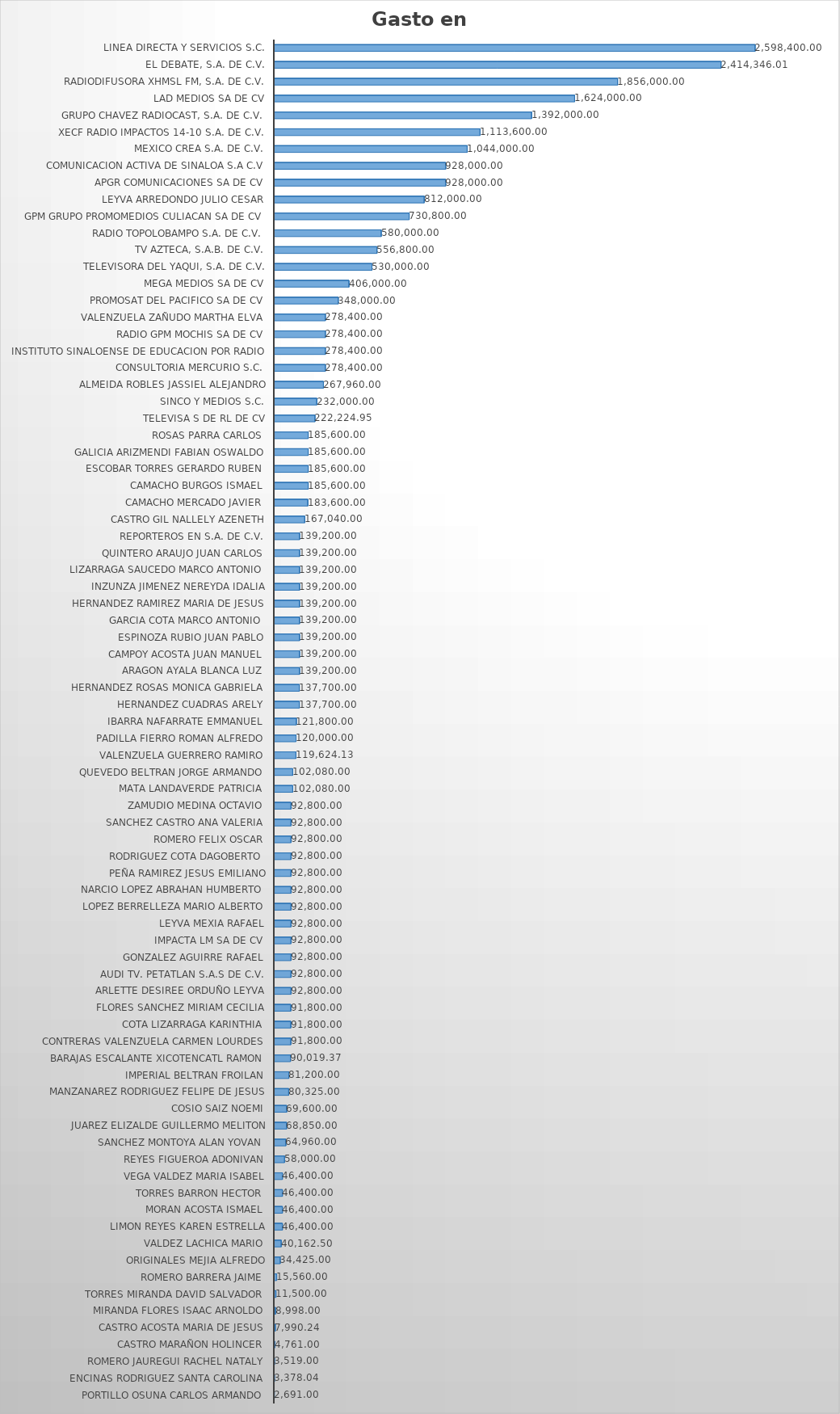
| Category | Suma |
|---|---|
| PORTILLO OSUNA CARLOS ARMANDO | 2691 |
| ENCINAS RODRIGUEZ SANTA CAROLINA | 3378.04 |
| ROMERO JAUREGUI RACHEL NATALY | 3519 |
| CASTRO MARAÑON HOLINCER | 4761 |
| CASTRO ACOSTA MARIA DE JESUS | 7990.24 |
| MIRANDA FLORES ISAAC ARNOLDO | 8998 |
| TORRES MIRANDA DAVID SALVADOR | 11500 |
| ROMERO BARRERA JAIME | 15560 |
| ORIGINALES MEJIA ALFREDO | 34425 |
| VALDEZ LACHICA MARIO | 40162.5 |
| LIMON REYES KAREN ESTRELLA | 46400 |
| MORAN ACOSTA ISMAEL | 46400 |
| TORRES BARRON HECTOR | 46400 |
| VEGA VALDEZ MARIA ISABEL | 46400 |
| REYES FIGUEROA ADONIVAN | 58000 |
| SANCHEZ MONTOYA ALAN YOVAN | 64960 |
| JUAREZ ELIZALDE GUILLERMO MELITON | 68850 |
| COSIO SAIZ NOEMI | 69600 |
| MANZANAREZ RODRIGUEZ FELIPE DE JESUS | 80325 |
| IMPERIAL BELTRAN FROILAN | 81200 |
| BARAJAS ESCALANTE XICOTENCATL RAMON | 90019.37 |
| CONTRERAS VALENZUELA CARMEN LOURDES | 91800 |
| COTA LIZARRAGA KARINTHIA | 91800 |
| FLORES SANCHEZ MIRIAM CECILIA | 91800 |
| ARLETTE DESIREE ORDUÑO LEYVA | 92800 |
| AUDI TV. PETATLAN S.A.S DE C.V. | 92800 |
| GONZALEZ AGUIRRE RAFAEL | 92800 |
| IMPACTA LM SA DE CV | 92800 |
| LEYVA MEXIA RAFAEL | 92800 |
| LOPEZ BERRELLEZA MARIO ALBERTO | 92800 |
| NARCIO LOPEZ ABRAHAN HUMBERTO | 92800 |
| PEÑA RAMIREZ JESUS EMILIANO | 92800 |
| RODRIGUEZ COTA DAGOBERTO | 92800 |
| ROMERO FELIX OSCAR | 92800 |
| SANCHEZ CASTRO ANA VALERIA | 92800 |
| ZAMUDIO MEDINA OCTAVIO | 92800 |
| MATA LANDAVERDE PATRICIA | 102080 |
| QUEVEDO BELTRAN JORGE ARMANDO | 102080 |
| VALENZUELA GUERRERO RAMIRO | 119624.13 |
| PADILLA FIERRO ROMAN ALFREDO | 120000 |
| IBARRA NAFARRATE EMMANUEL | 121800 |
| HERNANDEZ CUADRAS ARELY | 137700 |
| HERNANDEZ ROSAS MONICA GABRIELA | 137700 |
| ARAGON AYALA BLANCA LUZ | 139200 |
| CAMPOY ACOSTA JUAN MANUEL | 139200 |
| ESPINOZA RUBIO JUAN PABLO | 139200 |
| GARCIA COTA MARCO ANTONIO | 139200 |
| HERNANDEZ RAMIREZ MARIA DE JESUS | 139200 |
| INZUNZA JIMENEZ NEREYDA IDALIA | 139200 |
| LIZARRAGA SAUCEDO MARCO ANTONIO | 139200 |
| QUINTERO ARAUJO JUAN CARLOS | 139200 |
| REPORTEROS EN S.A. DE C.V. | 139200 |
| CASTRO GIL NALLELY AZENETH | 167040 |
| CAMACHO MERCADO JAVIER | 183600 |
| CAMACHO BURGOS ISMAEL | 185600 |
| ESCOBAR TORRES GERARDO RUBEN | 185600 |
| GALICIA ARIZMENDI FABIAN OSWALDO | 185600 |
| ROSAS PARRA CARLOS | 185600 |
| TELEVISA S DE RL DE CV | 222224.95 |
| SINCO Y MEDIOS S.C. | 232000 |
| ALMEIDA ROBLES JASSIEL ALEJANDRO | 267960 |
| CONSULTORIA MERCURIO S.C. | 278400 |
| INSTITUTO SINALOENSE DE EDUCACION POR RADIO | 278400 |
| RADIO GPM MOCHIS SA DE CV | 278400 |
| VALENZUELA ZAÑUDO MARTHA ELVA | 278400 |
| PROMOSAT DEL PACIFICO SA DE CV | 348000 |
| MEGA MEDIOS SA DE CV | 406000 |
| TELEVISORA DEL YAQUI, S.A. DE C.V. | 530000 |
| TV AZTECA, S.A.B. DE C.V. | 556800 |
| RADIO TOPOLOBAMPO S.A. DE C.V. | 580000 |
| GPM GRUPO PROMOMEDIOS CULIACAN SA DE CV | 730800 |
| LEYVA ARREDONDO JULIO CESAR | 812000 |
| APGR COMUNICACIONES SA DE CV | 928000 |
| COMUNICACION ACTIVA DE SINALOA S.A C.V | 928000 |
| MEXICO CREA S.A. DE C.V. | 1044000 |
| XECF RADIO IMPACTOS 14-10 S.A. DE C.V. | 1113600 |
| GRUPO CHAVEZ RADIOCAST, S.A. DE C.V. | 1392000 |
| LAD MEDIOS SA DE CV | 1624000 |
| RADIODIFUSORA XHMSL FM, S.A. DE C.V. | 1856000 |
| EL DEBATE, S.A. DE C.V. | 2414346.01 |
| LINEA DIRECTA Y SERVICIOS S.C. | 2598400 |